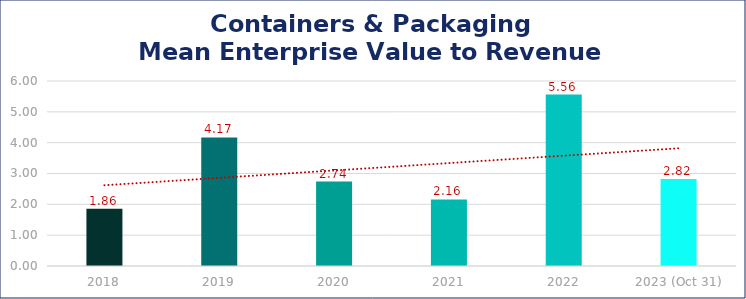
| Category | Containers & Packaging |
|---|---|
| 2018 | 1.86 |
| 2019 | 4.17 |
| 2020 | 2.74 |
| 2021 | 2.16 |
| 2022 | 5.56 |
| 2023 (Oct 31) | 2.82 |